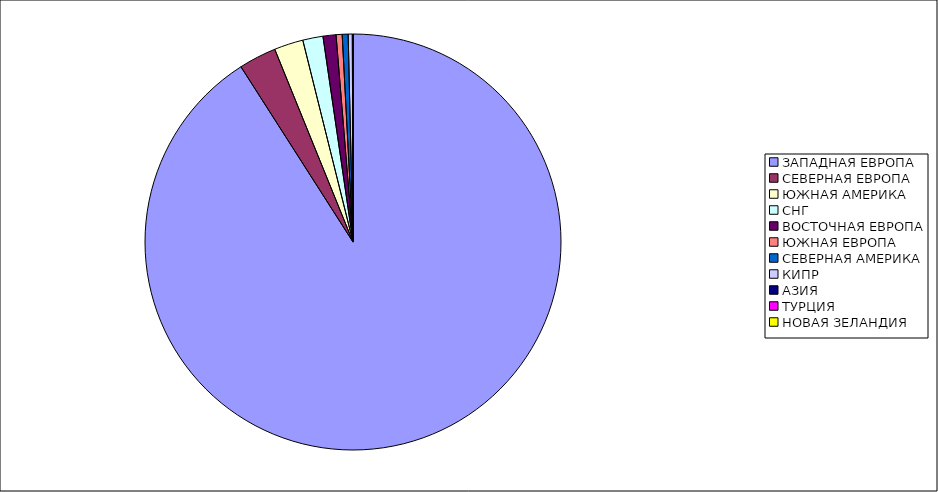
| Category | Оборот |
|---|---|
| ЗАПАДНАЯ ЕВРОПА | 0.909 |
| СЕВЕРНАЯ ЕВРОПА | 0.029 |
| ЮЖНАЯ АМЕРИКА | 0.023 |
| СНГ | 0.016 |
| ВОСТОЧНАЯ ЕВРОПА | 0.01 |
| ЮЖНАЯ ЕВРОПА | 0.005 |
| СЕВЕРНАЯ АМЕРИКА | 0.005 |
| КИПР | 0.003 |
| АЗИЯ | 0 |
| ТУРЦИЯ | 0 |
| НОВАЯ ЗЕЛАНДИЯ | 0 |